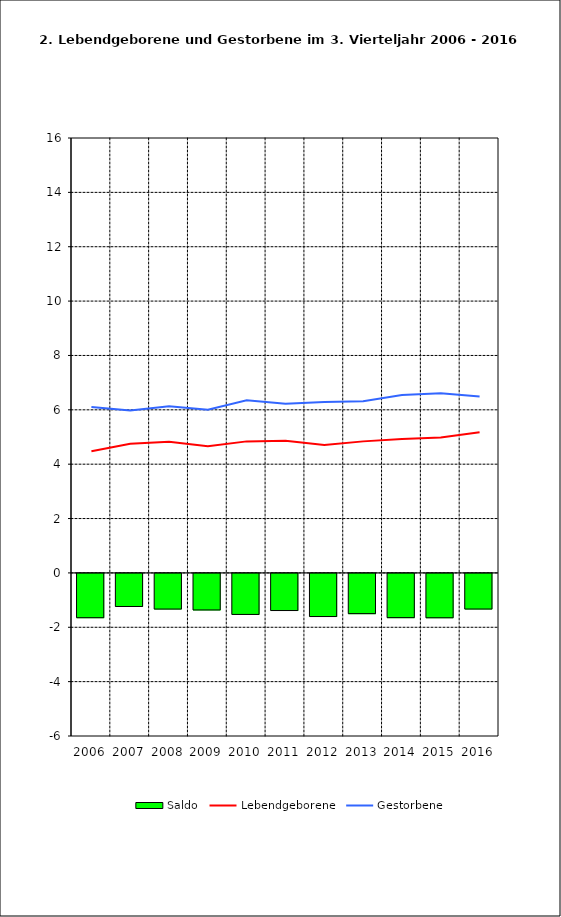
| Category | Saldo |
|---|---|
| 2005.0 | -1.63 |
| 2006.0 | -1.217 |
| 2007.0 | -1.312 |
| 2008.0 | -1.345 |
| 2009.0 | -1.509 |
| 2010.0 | -1.366 |
| 2011.0 | -1.587 |
| 2012.0 | -1.48 |
| 2013.0 | -1.627 |
| 2014.0 | -1.632 |
| 2015.0 | -1.311 |